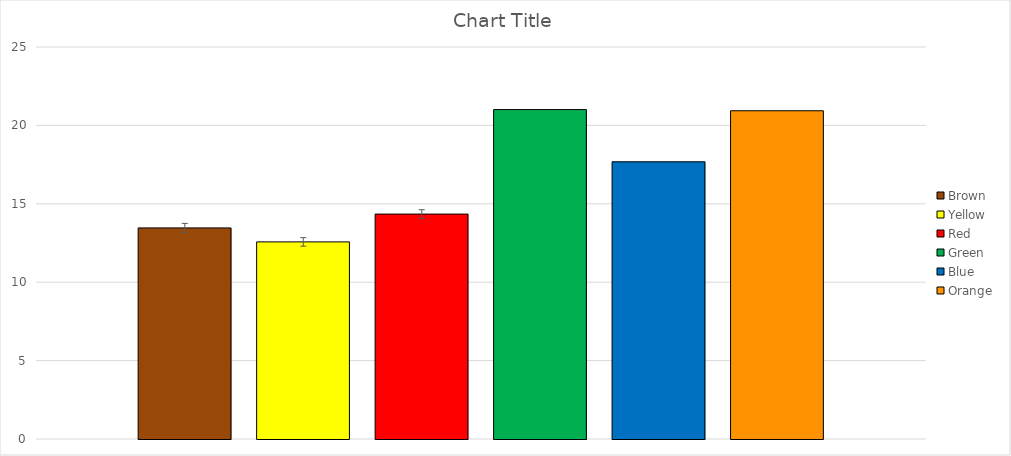
| Category | Brown | Yellow | Red | Green | Blue  | Orange |
|---|---|---|---|---|---|---|
| 0 | 13.462 | 12.571 | 14.344 | 21.009 | 17.68 | 20.934 |